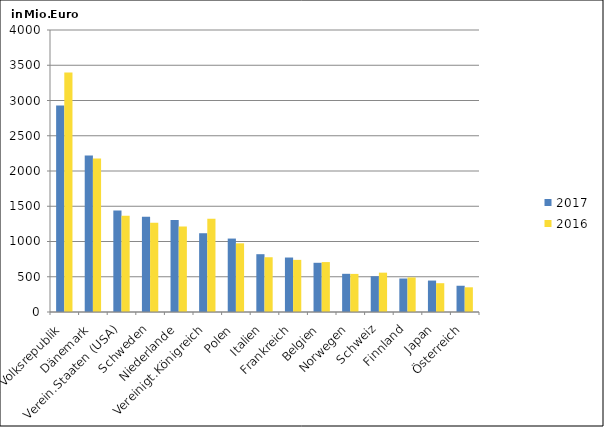
| Category | 2017 | 2016 |
|---|---|---|
| China, Volksrepublik | 2930.659 | 3397.054 |
| Dänemark | 2219.121 | 2176.442 |
| Verein.Staaten (USA) | 1438.031 | 1366.311 |
| Schweden | 1351.131 | 1266.044 |
| Niederlande | 1306.349 | 1211.533 |
| Vereinigt.Königreich | 1117.327 | 1323.488 |
| Polen | 1041.683 | 974.208 |
| Italien | 819.938 | 776.756 |
| Frankreich | 772.734 | 739.417 |
| Belgien | 697.989 | 708.121 |
| Norwegen | 541.658 | 540.315 |
| Schweiz | 507.05 | 558.022 |
| Finnland | 475.002 | 490.661 |
| Japan | 445.931 | 408.552 |
| Österreich | 372.41 | 350.386 |